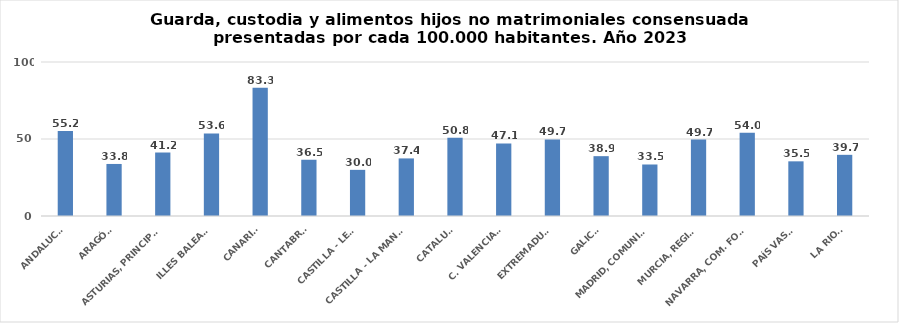
| Category | Series 0 |
|---|---|
| ANDALUCÍA | 55.162 |
| ARAGÓN | 33.795 |
| ASTURIAS, PRINCIPADO | 41.228 |
| ILLES BALEARS | 53.616 |
| CANARIAS | 83.329 |
| CANTABRIA | 36.532 |
| CASTILLA - LEÓN | 29.968 |
| CASTILLA - LA MANCHA | 37.393 |
| CATALUÑA | 50.753 |
| C. VALENCIANA | 47.085 |
| EXTREMADURA | 49.701 |
| GALICIA | 38.856 |
| MADRID, COMUNIDAD | 33.45 |
| MURCIA, REGIÓN | 49.656 |
| NAVARRA, COM. FORAL | 54.002 |
| PAÍS VASCO | 35.497 |
| LA RIOJA | 39.719 |